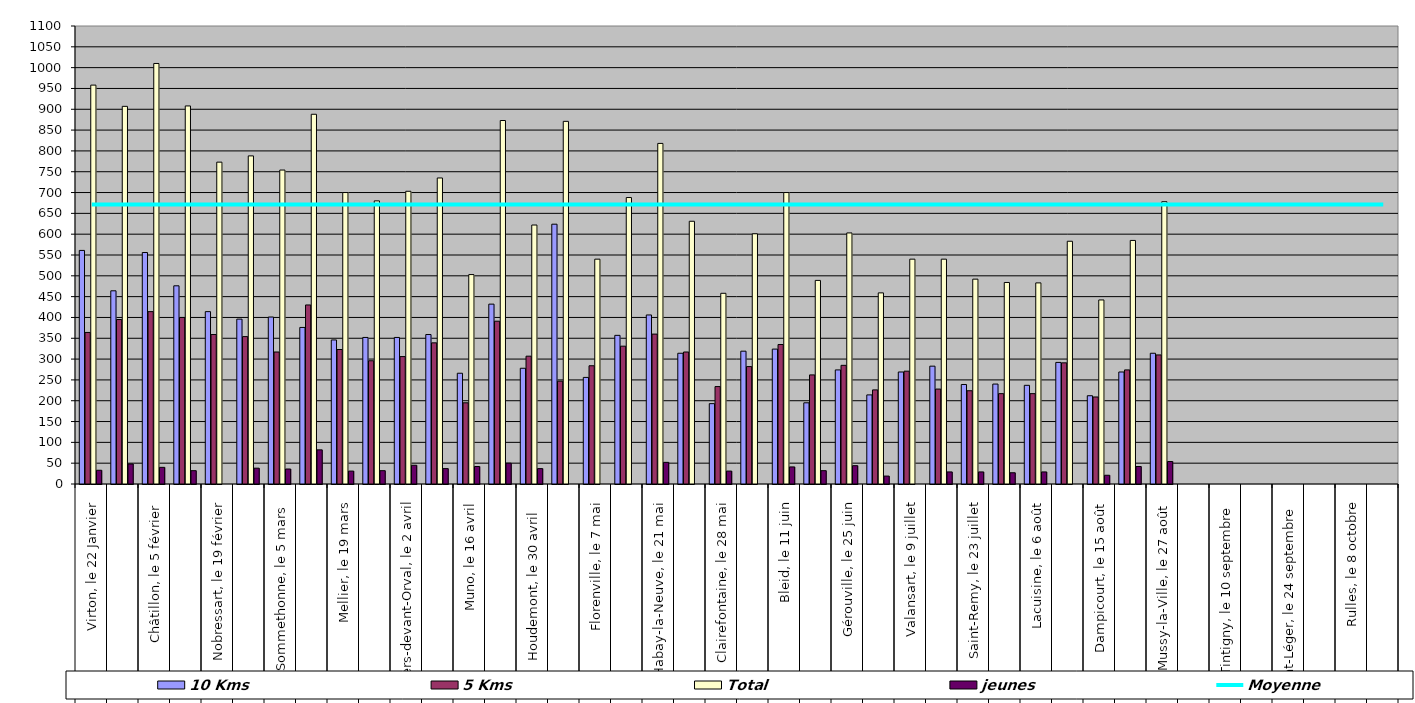
| Category | 10 Kms | 5 Kms | Total | jeunes |
|---|---|---|---|---|
| 0 | 561 | 364 | 958 | 33 |
| 1 | 464 | 395 | 907 | 48 |
| 2 | 556 | 414 | 1010 | 40 |
| 3 | 476 | 400 | 908 | 32 |
| 4 | 414 | 359 | 773 | 0 |
| 5 | 396 | 354 | 788 | 38 |
| 6 | 401 | 317 | 754 | 36 |
| 7 | 376 | 430 | 888 | 82 |
| 8 | 346 | 323 | 700 | 31 |
| 9 | 352 | 296 | 680 | 32 |
| 10 | 352 | 306 | 703 | 45 |
| 11 | 359 | 339 | 735 | 37 |
| 12 | 266 | 195 | 503 | 42 |
| 13 | 432 | 391 | 873 | 50 |
| 14 | 278 | 307 | 622 | 37 |
| 15 | 624 | 247 | 871 | 0 |
| 16 | 256 | 284 | 540 | 0 |
| 17 | 357 | 331 | 688 | 0 |
| 18 | 406 | 360 | 818 | 52 |
| 19 | 314 | 317 | 631 | 0 |
| 20 | 193 | 234 | 458 | 31 |
| 21 | 319 | 282 | 601 | 0 |
| 22 | 324 | 335 | 700 | 41 |
| 23 | 195 | 262 | 489 | 32 |
| 24 | 274 | 285 | 603 | 44 |
| 25 | 214 | 226 | 459 | 19 |
| 26 | 269 | 271 | 540 | 0 |
| 27 | 283 | 228 | 540 | 29 |
| 28 | 239 | 224 | 492 | 29 |
| 29 | 240 | 217 | 484 | 27 |
| 30 | 237 | 217 | 483 | 29 |
| 31 | 292 | 291 | 583 | 0 |
| 32 | 212 | 209 | 442 | 21 |
| 33 | 269 | 274 | 585 | 42 |
| 34 | 314 | 310 | 678 | 54 |
| 35 | 0 | 0 | 0 | 0 |
| 36 | 0 | 0 | 0 | 0 |
| 37 | 0 | 0 | 0 | 0 |
| 38 | 0 | 0 | 0 | 0 |
| 39 | 0 | 0 | 0 | 0 |
| 40 | 0 | 0 | 0 | 0 |
| 41 | 0 | 0 | 0 | 0 |